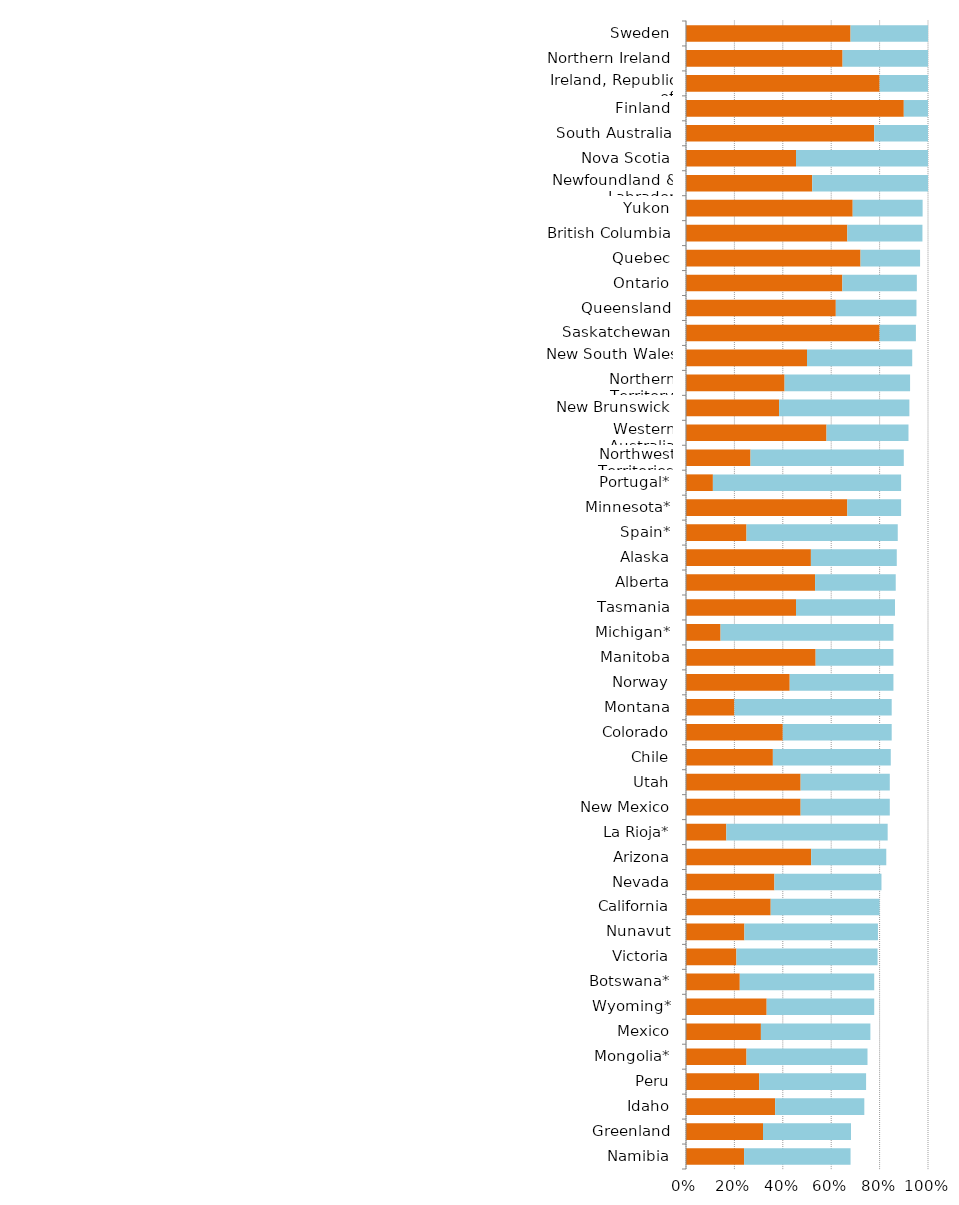
| Category | Series 0 | Series 1 |
|---|---|---|
| Namibia | 0.24 | 0.44 |
| Greenland | 0.318 | 0.364 |
| Idaho | 0.368 | 0.368 |
| Peru | 0.302 | 0.442 |
| Mongolia* | 0.25 | 0.5 |
| Mexico | 0.31 | 0.452 |
| Wyoming* | 0.333 | 0.444 |
| Botswana* | 0.222 | 0.556 |
| Victoria | 0.208 | 0.583 |
| Nunavut | 0.241 | 0.552 |
| California | 0.35 | 0.45 |
| Nevada | 0.365 | 0.442 |
| Arizona | 0.517 | 0.31 |
| La Rioja* | 0.167 | 0.667 |
| New Mexico | 0.474 | 0.368 |
| Utah | 0.474 | 0.368 |
| Chile | 0.359 | 0.487 |
| Colorado | 0.4 | 0.45 |
| Montana | 0.2 | 0.65 |
| Norway | 0.429 | 0.429 |
| Manitoba | 0.536 | 0.321 |
| Michigan* | 0.143 | 0.714 |
| Tasmania | 0.455 | 0.409 |
| Alberta | 0.533 | 0.333 |
| Alaska | 0.516 | 0.355 |
| Spain* | 0.25 | 0.625 |
| Minnesota* | 0.667 | 0.222 |
| Portugal* | 0.111 | 0.778 |
| Northwest Territories | 0.267 | 0.633 |
| Western Australia | 0.581 | 0.339 |
| New Brunswick | 0.385 | 0.538 |
| Northern Territory | 0.407 | 0.519 |
| New South Wales | 0.5 | 0.435 |
| Saskatchewan | 0.8 | 0.15 |
| Queensland | 0.619 | 0.333 |
| Ontario | 0.646 | 0.308 |
| Quebec | 0.721 | 0.246 |
| British Columbia | 0.667 | 0.31 |
| Yukon | 0.689 | 0.289 |
| Newfoundland & Labrador | 0.522 | 0.478 |
| Nova Scotia | 0.455 | 0.545 |
| South Australia | 0.778 | 0.222 |
| Finland | 0.9 | 0.1 |
| Ireland, Republic of | 0.8 | 0.2 |
| Northern Ireland | 0.647 | 0.353 |
| Sweden | 0.68 | 0.32 |